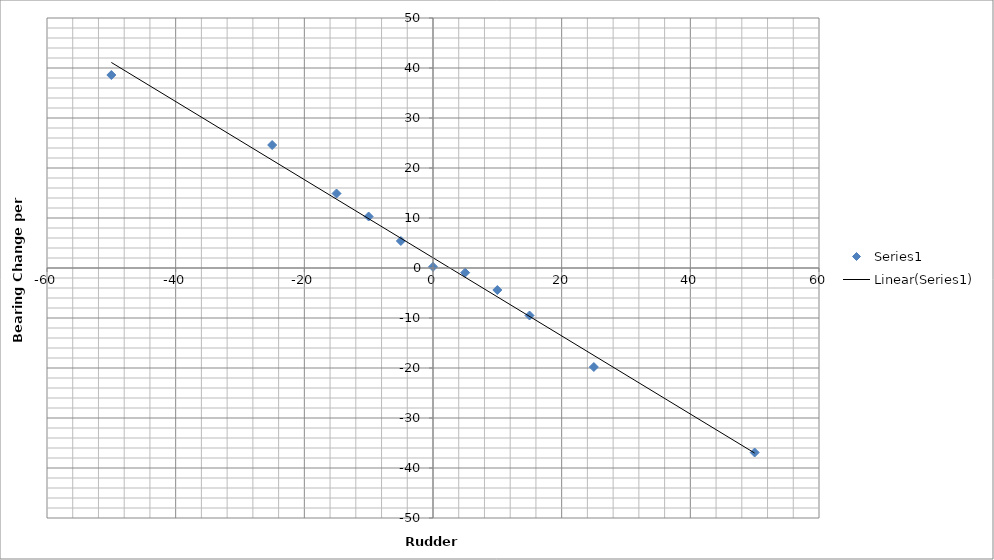
| Category | Series 0 |
|---|---|
| -50.0 | 38.6 |
| -25.0 | 24.6 |
| -15.0 | 14.9 |
| -10.0 | 10.3 |
| -5.0 | 5.4 |
| 0.0 | 0.24 |
| 5.0 | -0.93 |
| 10.0 | -4.4 |
| 15.0 | -9.5 |
| 25.0 | -19.8 |
| 50.0 | -36.9 |